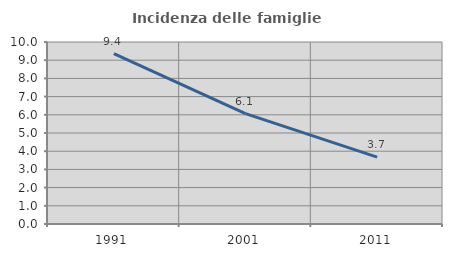
| Category | Incidenza delle famiglie numerose |
|---|---|
| 1991.0 | 9.359 |
| 2001.0 | 6.067 |
| 2011.0 | 3.678 |